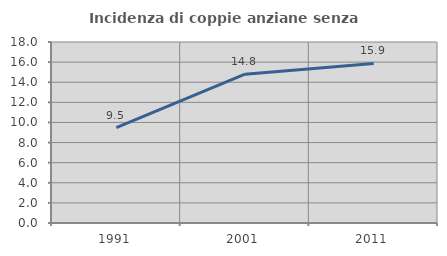
| Category | Incidenza di coppie anziane senza figli  |
|---|---|
| 1991.0 | 9.484 |
| 2001.0 | 14.797 |
| 2011.0 | 15.864 |